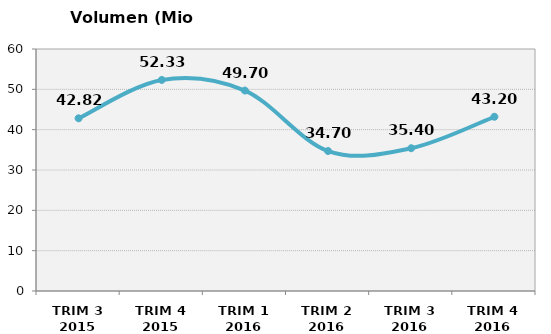
| Category | Volumen (Mio consumiciones) |
|---|---|
| TRIM 3 2015 | 42.818 |
| TRIM 4 2015 | 52.334 |
| TRIM 1 2016 | 49.7 |
| TRIM 2 2016 | 34.7 |
| TRIM 3 2016 | 35.4 |
| TRIM 4 2016 | 43.2 |